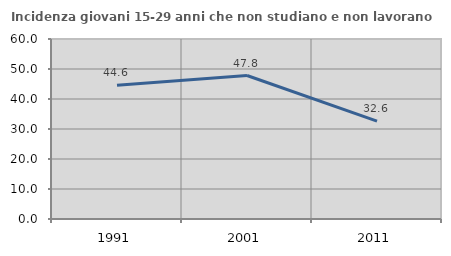
| Category | Incidenza giovani 15-29 anni che non studiano e non lavorano  |
|---|---|
| 1991.0 | 44.623 |
| 2001.0 | 47.826 |
| 2011.0 | 32.624 |